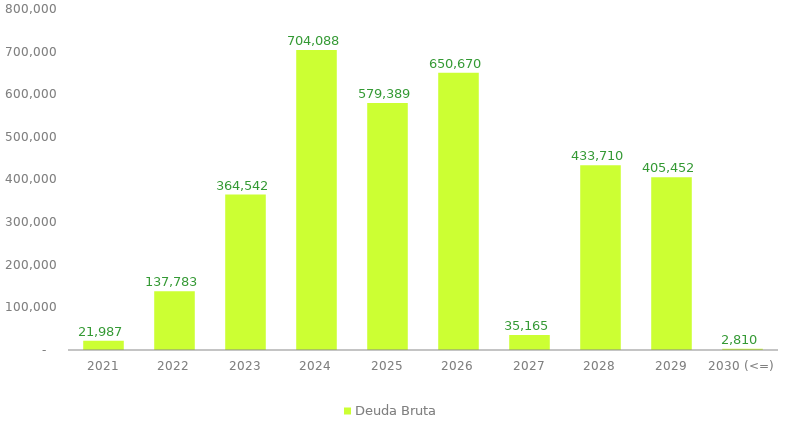
| Category | Deuda Bruta |
|---|---|
| 2021 | 21987.119 |
| 2022 | 137783.312 |
| 2023 | 364542.412 |
| 2024 | 704088.239 |
| 2025 | 579389.444 |
| 2026 | 650670.036 |
| 2027 | 35165.305 |
| 2028 | 433709.664 |
| 2029 | 405451.748 |
| 2030 (<=) | 2810.348 |